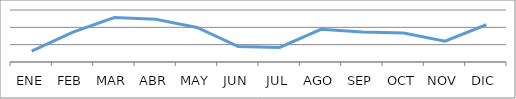
| Category | Porcentaje de niños menores de 3 años con suplementación de hierro y/o MN | Series 1 |
|---|---|---|
| ENE | 1.258 |  |
| FEB | 3.459 |  |
| MAR | 5.136 |  |
| ABR | 4.927 |  |
| MAY | 3.983 |  |
| JUN | 1.782 |  |
| JUL | 1.677 |  |
| AGO | 3.774 |  |
| SEP | 3.459 |  |
| OCT | 3.354 |  |
| NOV | 2.411 |  |
| DIC | 4.298 |  |